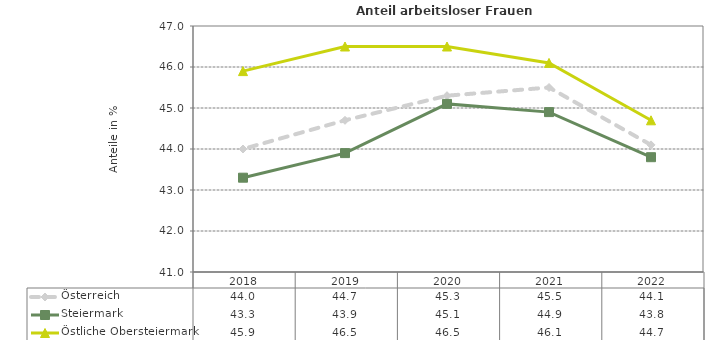
| Category | Österreich | Steiermark | Östliche Obersteiermark |
|---|---|---|---|
| 2022.0 | 44.1 | 43.8 | 44.7 |
| 2021.0 | 45.5 | 44.9 | 46.1 |
| 2020.0 | 45.3 | 45.1 | 46.5 |
| 2019.0 | 44.7 | 43.9 | 46.5 |
| 2018.0 | 44 | 43.3 | 45.9 |